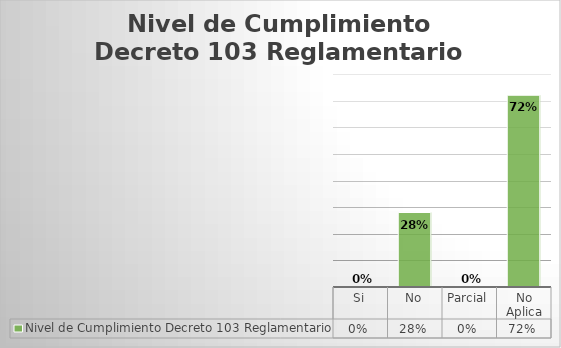
| Category | Nivel de Cumplimiento Decreto 103 Reglamentario |
|---|---|
| Si | 0 |
| No | 0.28 |
| Parcial | 0 |
| No Aplica | 0.72 |